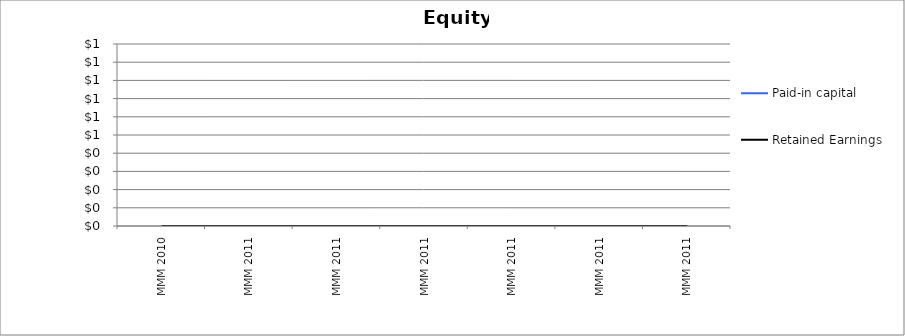
| Category | Paid-in capital | Retained Earnings |
|---|---|---|
| MMM 2010 | 0 | 0 |
| MMM 2011 | 0 | 0 |
| MMM 2011 | 0 | 0 |
| MMM 2011 | 0 | 0 |
| MMM 2011 | 0 | 0 |
| MMM 2011 | 0 | 0 |
| MMM 2011 | 0 | 0 |